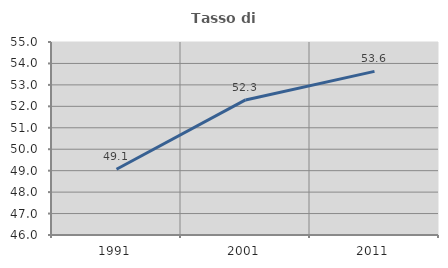
| Category | Tasso di occupazione   |
|---|---|
| 1991.0 | 49.065 |
| 2001.0 | 52.299 |
| 2011.0 | 53.632 |